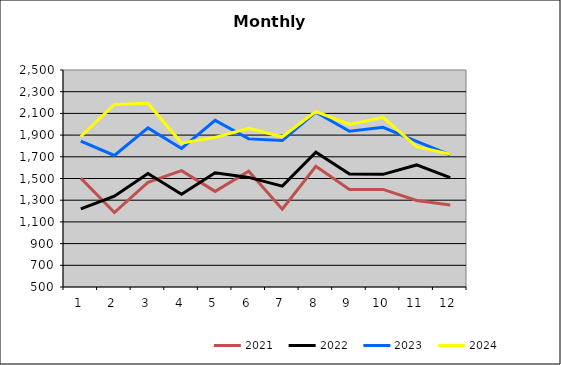
| Category | 2021 | 2022 | 2023 | 2024 |
|---|---|---|---|---|
| 0 | 1503.68 | 1219.945 | 1844.318 | 1887.12 |
| 1 | 1186.293 | 1336.681 | 1712.41 | 2182.42 |
| 2 | 1464.516 | 1545.46 | 1966.844 | 2193.277 |
| 3 | 1572.076 | 1354.89 | 1776.83 | 1826.456 |
| 4 | 1381.3 | 1552.185 | 2036.149 | 1879.077 |
| 5 | 1567.527 | 1510.185 | 1865.135 | 1962.376 |
| 6 | 1216.971 | 1429.988 | 1849.967 | 1884.713 |
| 7 | 1613.137 | 1742.939 | 2111.02 | 2117.589 |
| 8 | 1398.947 | 1540.494 | 1935.176 | 1997.536 |
| 9 | 1399.401 | 1538.281 | 1971.471 | 2063.568 |
| 10 | 1297.013 | 1625.039 | 1842.128 | 1793.763 |
| 11 | 1256.018 | 1508.631 | 1716.881 | 1724.332 |